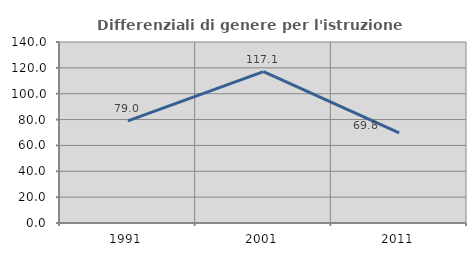
| Category | Differenziali di genere per l'istruzione superiore |
|---|---|
| 1991.0 | 78.962 |
| 2001.0 | 117.115 |
| 2011.0 | 69.796 |